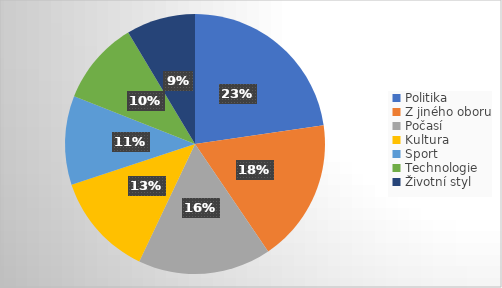
| Category | Series 0 |
|---|---|
| Politika | 37 |
| Z jiného oboru | 29 |
| Počasí | 27 |
| Kultura | 21 |
| Sport | 18 |
| Technologie | 17 |
| Životní styl | 14 |